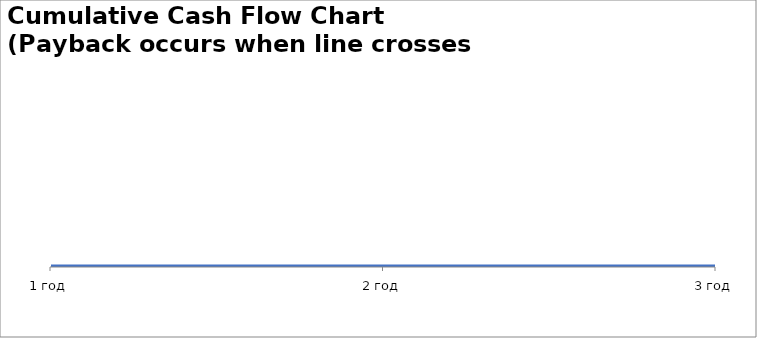
| Category | Series 0 |
|---|---|
| 1 год | 0 |
| 2 год | 0 |
| 3 год | 0 |